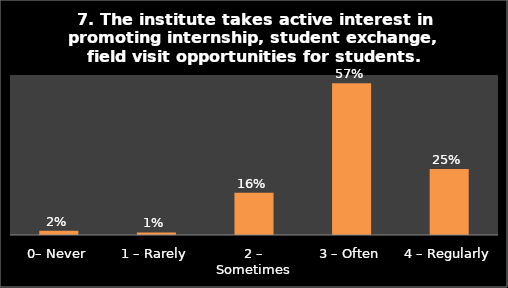
| Category | Series 0 |
|---|---|
| 0– Never | 0.016 |
| 1 – Rarely | 0.01 |
| 2 – Sometimes | 0.158 |
| 3 – Often | 0.569 |
| 4 – Regularly | 0.247 |